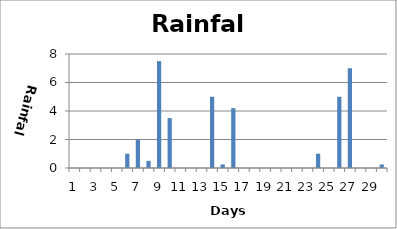
| Category | Rain |
|---|---|
| 0 | 0 |
| 1 | 0 |
| 2 | 0 |
| 3 | 0 |
| 4 | 0 |
| 5 | 1 |
| 6 | 2 |
| 7 | 0.5 |
| 8 | 7.5 |
| 9 | 3.5 |
| 10 | 0 |
| 11 | 0 |
| 12 | 0 |
| 13 | 5 |
| 14 | 0.25 |
| 15 | 4.2 |
| 16 | 0 |
| 17 | 0 |
| 18 | 0 |
| 19 | 0 |
| 20 | 0 |
| 21 | 0 |
| 22 | 0 |
| 23 | 1 |
| 24 | 0 |
| 25 | 5 |
| 26 | 7 |
| 27 | 0 |
| 28 | 0 |
| 29 | 0.25 |